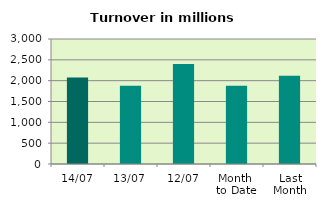
| Category | Series 0 |
|---|---|
| 14/07 | 2076.445 |
| 13/07 | 1879.026 |
| 12/07 | 2397.198 |
| Month 
to Date | 1878.744 |
| Last
Month | 2115.436 |